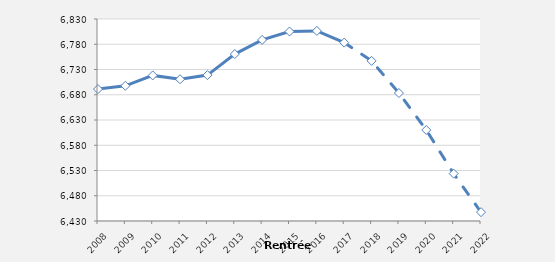
| Category | Series 0 |
|---|---|
| 2008.0 | 6691.2 |
| 2009.0 | 6697.7 |
| 2010.0 | 6718.3 |
| 2011.0 | 6710.7 |
| 2012.0 | 6718.9 |
| 2013.0 | 6760.6 |
| 2014.0 | 6788.6 |
| 2015.0 | 6805.2 |
| 2016.0 | 6806.4 |
| 2017.0 | 6783.3 |
| 2018.0 | 6747.1 |
| 2019.0 | 6683.4 |
| 2020.0 | 6610.2 |
| 2021.0 | 6523.8 |
| 2022.0 | 6447.5 |